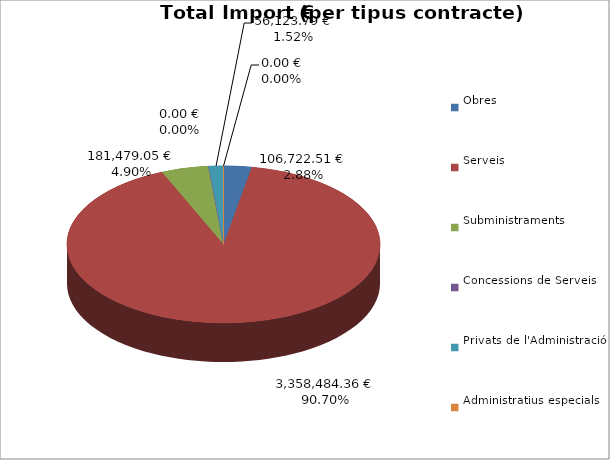
| Category | Total preu
(amb IVA) |
|---|---|
| Obres | 106722.51 |
| Serveis | 3358484.36 |
| Subministraments | 181479.05 |
| Concessions de Serveis | 0 |
| Privats de l'Administració | 56123.79 |
| Administratius especials | 0 |